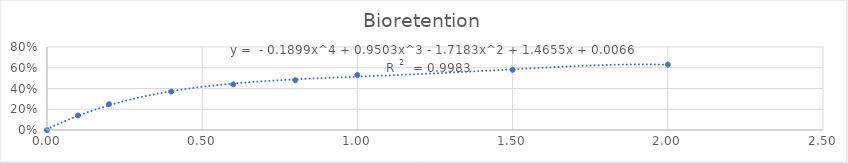
| Category | Series 0 |
|---|---|
| 0.0 | 0 |
| 0.1 | 0.14 |
| 0.2 | 0.25 |
| 0.4 | 0.37 |
| 0.6 | 0.44 |
| 0.8 | 0.48 |
| 1.0 | 0.53 |
| 1.5 | 0.58 |
| 2.0 | 0.63 |